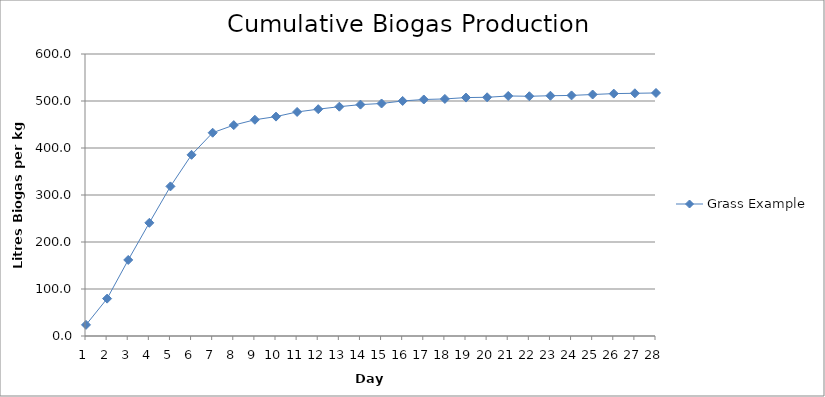
| Category | Grass Example |
|---|---|
| 1.0 | 23.7 |
| 2.0 | 79.5 |
| 3.0 | 161.8 |
| 4.0 | 240.8 |
| 5.0 | 318.3 |
| 6.0 | 385.5 |
| 7.0 | 432.5 |
| 8.0 | 448.7 |
| 9.0 | 460.1 |
| 10.0 | 466.8 |
| 11.0 | 476.7 |
| 12.0 | 482.6 |
| 13.0 | 487.9 |
| 14.0 | 492.3 |
| 15.0 | 494.7 |
| 16.0 | 500.1 |
| 17.0 | 503.2 |
| 18.0 | 504.4 |
| 19.0 | 507.3 |
| 20.0 | 507.9 |
| 21.0 | 510.7 |
| 22.0 | 510.1 |
| 23.0 | 511.2 |
| 24.0 | 511.9 |
| 25.0 | 513.8 |
| 26.0 | 515.7 |
| 27.0 | 516.4 |
| 28.0 | 517.1 |